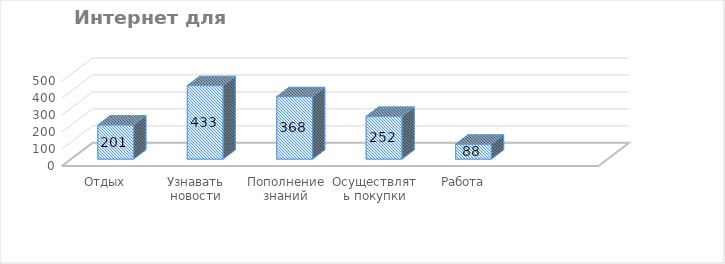
| Category | Series 0 |
|---|---|
| Отдых | 201 |
| Узнавать новости | 433 |
| Пополнение знаний | 368 |
| Осуществлять покупки | 252 |
| Работа | 88 |